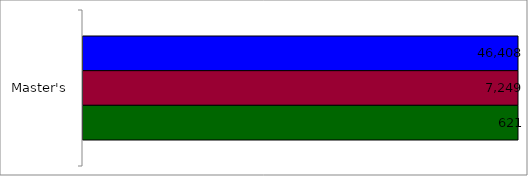
| Category | 50 states and D.C. | SREB states | State |
|---|---|---|---|
| Master's | 46408 | 7249 | 621 |